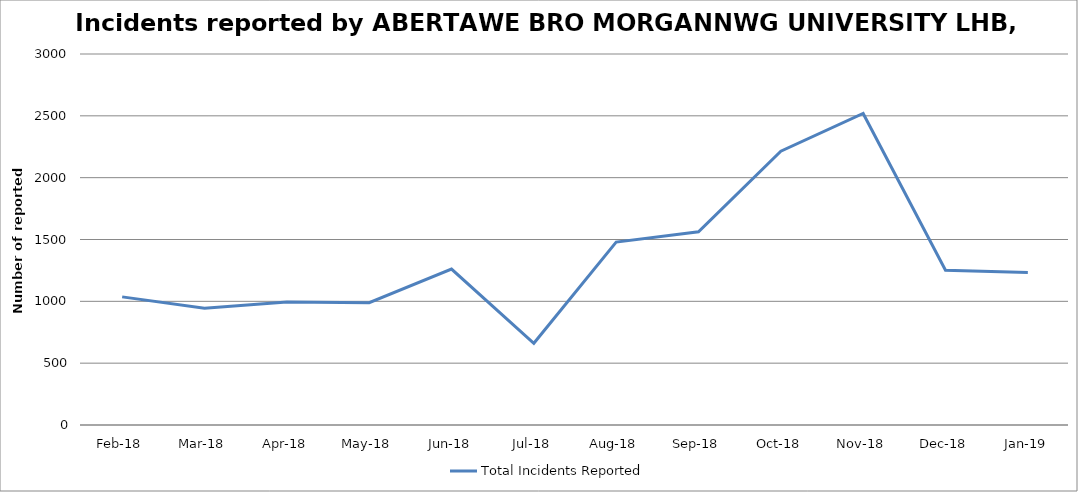
| Category | Total Incidents Reported |
|---|---|
| Feb-18 | 1036 |
| Mar-18 | 945 |
| Apr-18 | 994 |
| May-18 | 989 |
| Jun-18 | 1261 |
| Jul-18 | 661 |
| Aug-18 | 1479 |
| Sep-18 | 1562 |
| Oct-18 | 2214 |
| Nov-18 | 2519 |
| Dec-18 | 1251 |
| Jan-19 | 1234 |